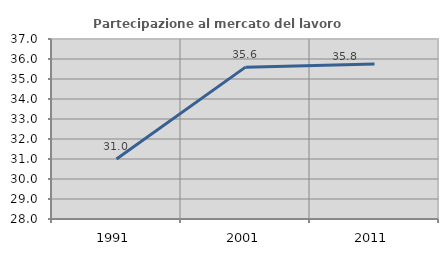
| Category | Partecipazione al mercato del lavoro  femminile |
|---|---|
| 1991.0 | 31.004 |
| 2001.0 | 35.593 |
| 2011.0 | 35.751 |